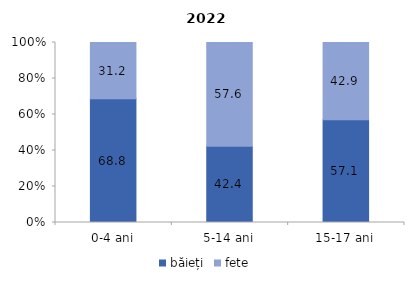
| Category | băieți | fete |
|---|---|---|
| 0-4 ani | 68.8 | 31.2 |
| 5-14 ani | 42.4 | 57.6 |
| 15-17 ani | 57.1 | 42.9 |